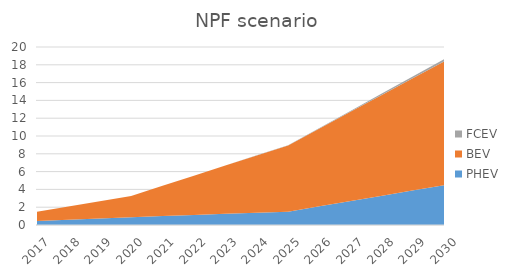
| Category | PHEV | BEV | FCEV |
|---|---|---|---|
| 2017.0 | 450304.671 | 1039273.226 | 1513.565 |
| 2018.0 | 593611.57 | 1487566.831 | 2096.39 |
| 2019.0 | 736918.469 | 1935860.437 | 2679.216 |
| 2020.0 | 880225.369 | 2384154.043 | 3262.041 |
| 2021.0 | 1003592.159 | 3396757.86 | 7174.589 |
| 2022.0 | 1126958.95 | 4409361.677 | 11087.137 |
| 2023.0 | 1250325.741 | 5421965.493 | 14999.686 |
| 2024.0 | 1373692.531 | 6434569.31 | 18912.234 |
| 2025.0 | 1497059.322 | 7447173.127 | 22824.782 |
| 2026.0 | 2095756.224 | 8748133.381 | 64838.088 |
| 2027.0 | 2694453.126 | 10049093.635 | 106851.394 |
| 2028.0 | 3293150.028 | 11350053.889 | 148864.7 |
| 2029.0 | 3891846.93 | 12651014.143 | 190878.006 |
| 2030.0 | 4490543.832 | 13951974.397 | 232891.312 |